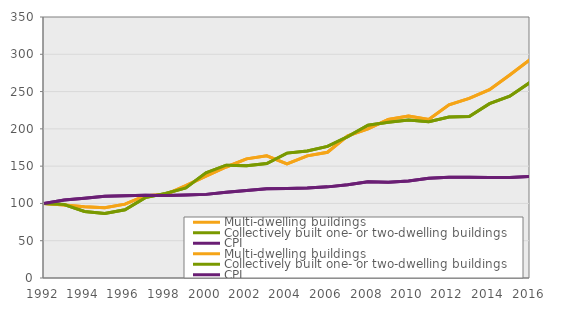
| Category | Multi-dwelling buildings | Collectively built one- or two-dwelling buildings | CPI |
|---|---|---|---|
| 1992.0 | 100 | 100 | 100 |
| 1993.0 | 98.001 | 98.443 | 104.725 |
| 1994.0 | 95.502 | 89.303 | 106.987 |
| 1995.0 | 94.359 | 86.619 | 109.614 |
| 1996.0 | 99.023 | 91.411 | 110.199 |
| 1997.0 | 110.472 | 107.771 | 110.925 |
| 1998.0 | 111.827 | 113.314 | 110.629 |
| 1999.0 | 123.787 | 120.776 | 111.14 |
| 2000.0 | 136.491 | 141.055 | 112.138 |
| 2001.0 | 148.873 | 151.282 | 114.838 |
| 2002.0 | 159.778 | 150.409 | 117.314 |
| 2003.0 | 163.865 | 153.563 | 119.576 |
| 2004.0 | 153.004 | 167.508 | 120.019 |
| 2005.0 | 163.776 | 170.393 | 120.565 |
| 2006.0 | 168.584 | 176.54 | 122.203 |
| 2007.0 | 190.716 | 189.585 | 124.908 |
| 2008.0 | 199.845 | 204.885 | 129.203 |
| 2009.0 | 212.604 | 208.952 | 128.562 |
| 2010.0 | 217.279 | 211.73 | 130.05 |
| 2011.0 | 212.504 | 209.65 | 133.902 |
| 2012.0 | 232.182 | 215.77 | 135.093 |
| 2013.0 | 240.955 | 216.602 | 135.033 |
| 2014.0 | 252.504 | 233.834 | 134.788 |
| 2015.0 | 272.2 | 243.7 | 134.7 |
| 2016.0 | 292.8 | 262.2 | 136.1 |